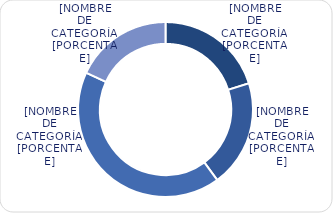
| Category | Series 0 |
|---|---|
| Entre 1-5 años | 3004.5 |
| Entre 6-10 años | 2946.2 |
| Entre 11-20 años | 6256.3 |
| Mayores de 20 años | 2696.7 |